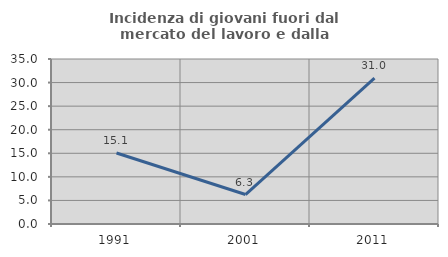
| Category | Incidenza di giovani fuori dal mercato del lavoro e dalla formazione  |
|---|---|
| 1991.0 | 15.068 |
| 2001.0 | 6.25 |
| 2011.0 | 30.952 |